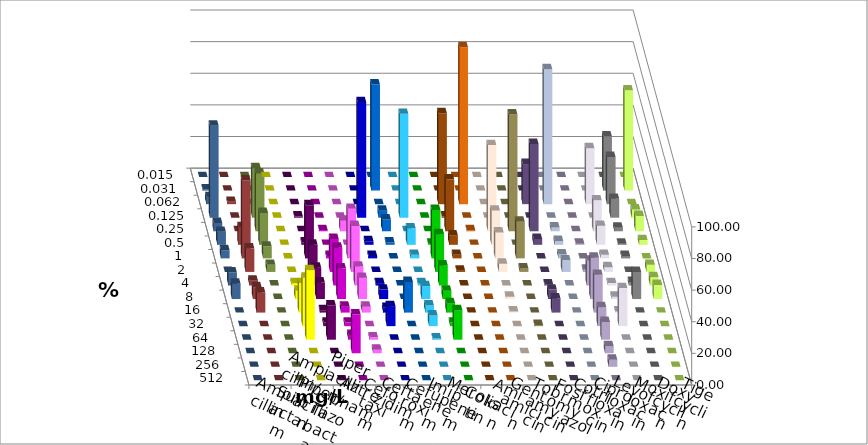
| Category | Ampicillin | Ampicillin/ Sulbactam | Piperacillin | Piperacillin/ Tazobactam | Aztreonam | Cefotaxim | Ceftazidim | Cefuroxim | Imipenem | Meropenem | Colistin | Amikacin | Gentamicin | Tobramycin | Fosfomycin | Cotrimoxazol | Ciprofloxacin | Levofloxacin | Moxifloxacin | Doxycyclin | Tigecyclin |
|---|---|---|---|---|---|---|---|---|---|---|---|---|---|---|---|---|---|---|---|---|---|
| 0.015 | 0 | 0 | 0 | 0 | 0 | 0 | 0 | 0 | 0 | 0 | 0 | 0 | 0 | 0 | 0 | 0 | 0 | 0 | 0 | 0 | 0 |
| 0.031 | 0 | 0 | 0 | 0 | 0 | 67.164 | 0 | 0 | 0 | 0 | 0 | 0 | 0 | 0 | 0 | 0 | 34.328 | 63.433 | 0.746 | 0 | 0 |
| 0.062 | 0 | 0 | 0 | 0 | 0 | 0 | 0 | 0 | 57.463 | 99.254 | 0 | 0 | 25.373 | 85.366 | 0 | 35.338 | 29.851 | 0 | 4.478 | 1.493 | 0 |
| 0.125 | 0 | 0.746 | 0 | 0 | 73.134 | 4.478 | 65.672 | 0 | 0.746 | 0 | 0 | 0 | 0 | 0 | 0 | 0 | 11.94 | 5.224 | 58.209 | 0 | 31.343 |
| 0.25 | 0 | 0 | 0.746 | 6.716 | 0 | 7.463 | 0 | 0 | 32.836 | 0.746 | 54.478 | 73.881 | 55.224 | 2.439 | 0 | 19.549 | 2.239 | 9.701 | 5.224 | 0 | 36.567 |
| 0.5 | 0 | 1.493 | 0 | 0 | 2.239 | 1.493 | 10.448 | 0.746 | 5.97 | 0 | 21.642 | 0 | 3.731 | 2.439 | 0.746 | 12.03 | 0.746 | 2.985 | 8.209 | 11.194 | 20.149 |
| 1.0 | 0 | 33.582 | 1.493 | 31.343 | 1.493 | 0 | 2.239 | 30.597 | 2.239 | 0 | 16.418 | 23.134 | 0 | 2.439 | 0 | 2.256 | 1.493 | 0 | 5.224 | 49.254 | 7.463 |
| 2.0 | 0 | 17.164 | 20.896 | 29.104 | 0 | 0 | 0 | 23.881 | 0.746 | 0 | 5.224 | 2.239 | 0 | 7.317 | 1.493 | 3.008 | 0 | 4.478 | 0 | 14.925 | 4.478 |
| 4.0 | 1.493 | 11.194 | 23.881 | 11.94 | 1.493 | 0 | 1.493 | 12.687 | 0 | 0 | 0 | 0 | 0.746 | 0 | 15.672 | 1.504 | 2.239 | 5.224 | 8.209 | 2.985 | 0 |
| 8.0 | 5.224 | 10.448 | 19.403 | 13.433 | 5.97 | 0 | 8.209 | 5.224 | 0 | 0 | 1.493 | 0 | 5.97 | 0 | 26.119 | 1.504 | 17.164 | 8.955 | 9.701 | 7.463 | 0 |
| 16.0 | 18.657 | 1.493 | 3.731 | 3.731 | 2.985 | 19.403 | 4.478 | 5.97 | 0 | 0 | 0.746 | 0 | 8.955 | 0 | 23.881 | 0.752 | 0 | 0 | 0 | 12.687 | 0 |
| 32.0 | 30.597 | 2.239 | 2.239 | 0 | 12.687 | 0 | 6.716 | 2.239 | 0 | 0 | 0 | 0.746 | 0 | 0 | 11.94 | 24.06 | 0 | 0 | 0 | 0 | 0 |
| 64.0 | 44.03 | 21.642 | 2.985 | 1.493 | 0 | 0 | 0.746 | 18.657 | 0 | 0 | 0 | 0 | 0 | 0 | 11.194 | 0 | 0 | 0 | 0 | 0 | 0 |
| 128.0 | 0 | 0 | 24.627 | 2.239 | 0 | 0 | 0 | 0 | 0 | 0 | 0 | 0 | 0 | 0 | 4.478 | 0 | 0 | 0 | 0 | 0 | 0 |
| 256.0 | 0 | 0 | 0 | 0 | 0 | 0 | 0 | 0 | 0 | 0 | 0 | 0 | 0 | 0 | 4.478 | 0 | 0 | 0 | 0 | 0 | 0 |
| 512.0 | 0 | 0 | 0 | 0 | 0 | 0 | 0 | 0 | 0 | 0 | 0 | 0 | 0 | 0 | 0 | 0 | 0 | 0 | 0 | 0 | 0 |